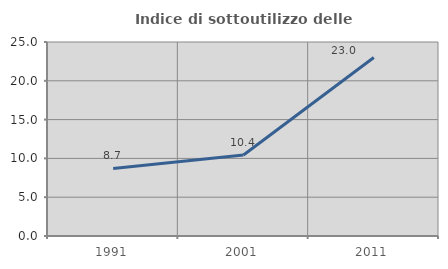
| Category | Indice di sottoutilizzo delle abitazioni  |
|---|---|
| 1991.0 | 8.708 |
| 2001.0 | 10.436 |
| 2011.0 | 23.01 |